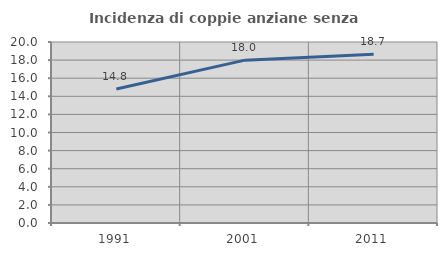
| Category | Incidenza di coppie anziane senza figli  |
|---|---|
| 1991.0 | 14.809 |
| 2001.0 | 17.997 |
| 2011.0 | 18.658 |